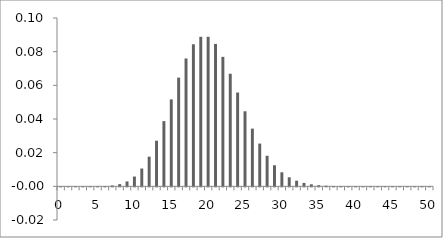
| Category | Series 0 |
|---|---|
| 0.0 | 0 |
| 1.0 | 0 |
| 2.0 | 0 |
| 3.0 | 0 |
| 4.0 | 0 |
| 5.0 | 0 |
| 6.0 | 0 |
| 7.0 | 0.001 |
| 8.0 | 0.001 |
| 9.0 | 0.003 |
| 10.0 | 0.006 |
| 11.0 | 0.011 |
| 12.0 | 0.018 |
| 13.0 | 0.027 |
| 14.0 | 0.039 |
| 15.0 | 0.052 |
| 16.0 | 0.065 |
| 17.0 | 0.076 |
| 18.0 | 0.084 |
| 19.0 | 0.089 |
| 20.0 | 0.089 |
| 21.0 | 0.085 |
| 22.0 | 0.077 |
| 23.0 | 0.067 |
| 24.0 | 0.056 |
| 25.0 | 0.045 |
| 26.0 | 0.034 |
| 27.0 | 0.025 |
| 28.0 | 0.018 |
| 29.0 | 0.013 |
| 30.0 | 0.008 |
| 31.0 | 0.005 |
| 32.0 | 0.003 |
| 33.0 | 0.002 |
| 34.0 | 0.001 |
| 35.0 | 0.001 |
| 36.0 | 0 |
| 37.0 | 0 |
| 38.0 | 0 |
| 39.0 | 0 |
| 40.0 | 0 |
| 41.0 | 0 |
| 42.0 | 0 |
| 43.0 | 0 |
| 44.0 | 0 |
| 45.0 | 0 |
| 46.0 | 0 |
| 47.0 | 0 |
| 48.0 | 0 |
| 49.0 | 0 |
| 50.0 | 0 |